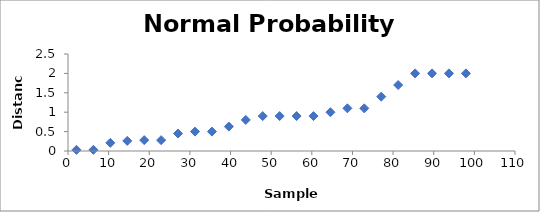
| Category | Series 0 |
|---|---|
| 2.0833333333333335 | 0.03 |
| 6.25 | 0.03 |
| 10.416666666666668 | 0.21 |
| 14.583333333333334 | 0.26 |
| 18.75 | 0.28 |
| 22.916666666666668 | 0.28 |
| 27.083333333333332 | 0.45 |
| 31.25 | 0.5 |
| 35.41666666666667 | 0.5 |
| 39.583333333333336 | 0.63 |
| 43.75000000000001 | 0.8 |
| 47.91666666666667 | 0.9 |
| 52.083333333333336 | 0.9 |
| 56.25000000000001 | 0.9 |
| 60.41666666666667 | 0.9 |
| 64.58333333333334 | 1 |
| 68.75 | 1.1 |
| 72.91666666666667 | 1.1 |
| 77.08333333333333 | 1.4 |
| 81.25 | 1.7 |
| 85.41666666666667 | 2 |
| 89.58333333333333 | 2 |
| 93.75 | 2 |
| 97.91666666666667 | 2 |